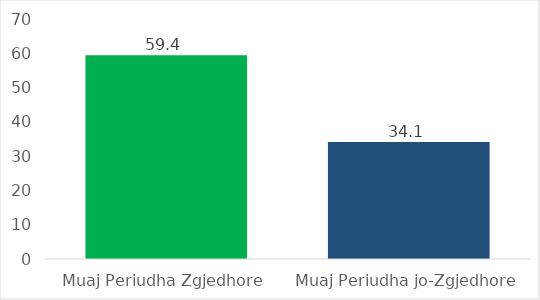
| Category | Mesatarisht Pagesa për Muaj |
|---|---|
| Muaj Periudha Zgjedhore | 59.441 |
| Muaj Periudha jo-Zgjedhore | 34.107 |